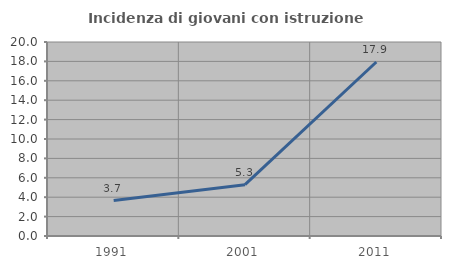
| Category | Incidenza di giovani con istruzione universitaria |
|---|---|
| 1991.0 | 3.651 |
| 2001.0 | 5.294 |
| 2011.0 | 17.941 |